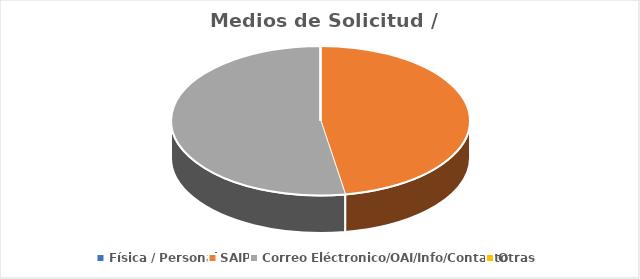
| Category | Series 0 |
|---|---|
| Física / Personal | 0 |
| SAIP | 9 |
| Correo Eléctronico/OAI/Info/Contacto | 10 |
| Otras | 0 |